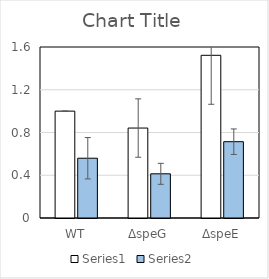
| Category | Series 0 | Series 1 |
|---|---|---|
| WT | 1 | 0.559 |
| ΔspeG | 0.842 | 0.413 |
| ΔspeE | 1.522 | 0.714 |